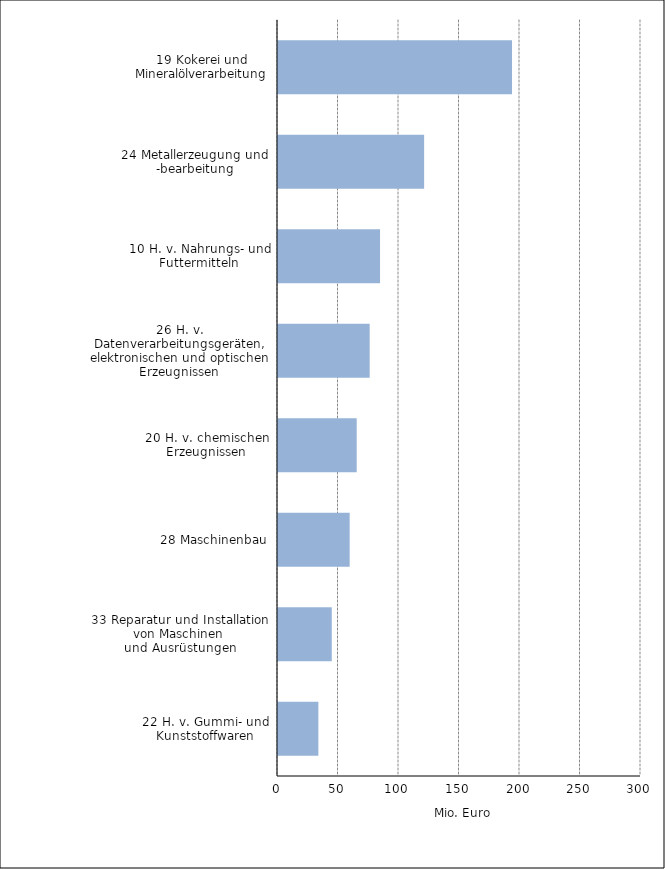
| Category | Mio. Euro |
|---|---|
| 19 Kokerei und Mineralölverarbeitung | 193.404 |
| 24 Metallerzeugung und -bearbeitung | 120.773 |
| 10 H. v. Nahrungs- und Futtermitteln | 84.326 |
| 26 H. v. Datenverarbeitungsgeräten, elektronischen und optischen Erzeugnissen | 75.775 |
| 20 H. v. chemischen Erzeugnissen | 65.053 |
| 28 Maschinenbau | 59.231 |
| 33 Reparatur und Installation von Maschinen 
und Ausrüstungen | 44.445 |
| 22 H. v. Gummi- und Kunststoffwaren | 33.361 |